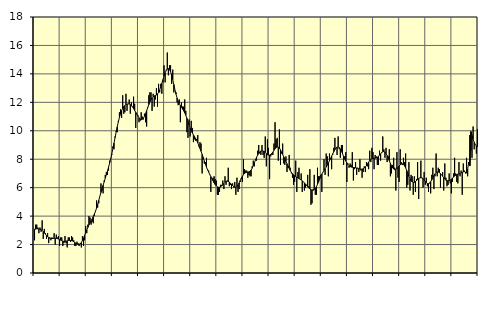
| Category | Piggar | Series 1 |
|---|---|---|
| nan | 2.3 | 3.09 |
| 87.0 | 3.4 | 3.09 |
| 87.0 | 3.4 | 3.11 |
| 87.0 | 3.2 | 3.11 |
| 87.0 | 2.8 | 3.1 |
| 87.0 | 3.2 | 3.08 |
| 87.0 | 2.9 | 3.04 |
| 87.0 | 3.7 | 2.99 |
| 87.0 | 2.4 | 2.91 |
| 87.0 | 3.1 | 2.82 |
| 87.0 | 2.8 | 2.72 |
| 87.0 | 2.4 | 2.63 |
| nan | 2.8 | 2.55 |
| 88.0 | 2.1 | 2.5 |
| 88.0 | 2.5 | 2.45 |
| 88.0 | 2.3 | 2.43 |
| 88.0 | 2.5 | 2.43 |
| 88.0 | 2.4 | 2.43 |
| 88.0 | 2.8 | 2.44 |
| 88.0 | 2 | 2.44 |
| 88.0 | 2.7 | 2.44 |
| 88.0 | 2.5 | 2.42 |
| 88.0 | 2.6 | 2.39 |
| 88.0 | 1.9 | 2.35 |
| nan | 2.5 | 2.31 |
| 89.0 | 2.5 | 2.27 |
| 89.0 | 1.9 | 2.24 |
| 89.0 | 2.1 | 2.22 |
| 89.0 | 2.6 | 2.23 |
| 89.0 | 2.1 | 2.24 |
| 89.0 | 1.8 | 2.26 |
| 89.0 | 2.5 | 2.28 |
| 89.0 | 2.5 | 2.29 |
| 89.0 | 2.2 | 2.29 |
| 89.0 | 2.6 | 2.27 |
| 89.0 | 2.5 | 2.25 |
| nan | 2.3 | 2.2 |
| 90.0 | 1.9 | 2.15 |
| 90.0 | 1.9 | 2.09 |
| 90.0 | 2.2 | 2.04 |
| 90.0 | 2.1 | 2.01 |
| 90.0 | 1.9 | 2 |
| 90.0 | 2.1 | 2.05 |
| 90.0 | 1.8 | 2.14 |
| 90.0 | 2.6 | 2.28 |
| 90.0 | 1.9 | 2.45 |
| 90.0 | 2.3 | 2.64 |
| 90.0 | 3.3 | 2.84 |
| nan | 2.8 | 3.03 |
| 91.0 | 3.4 | 3.21 |
| 91.0 | 4 | 3.38 |
| 91.0 | 3.9 | 3.52 |
| 91.0 | 3.4 | 3.67 |
| 91.0 | 3.6 | 3.81 |
| 91.0 | 3.5 | 3.97 |
| 91.0 | 4 | 4.14 |
| 91.0 | 4.3 | 4.34 |
| 91.0 | 5.1 | 4.57 |
| 91.0 | 4.6 | 4.83 |
| 91.0 | 4.9 | 5.11 |
| nan | 5.4 | 5.39 |
| 92.0 | 6.3 | 5.66 |
| 92.0 | 5.8 | 5.93 |
| 92.0 | 5.6 | 6.17 |
| 92.0 | 6.5 | 6.41 |
| 92.0 | 6.9 | 6.66 |
| 92.0 | 7.1 | 6.91 |
| 92.0 | 6.9 | 7.16 |
| 92.0 | 7.2 | 7.44 |
| 92.0 | 7.9 | 7.73 |
| 92.0 | 8 | 8.04 |
| 92.0 | 8.3 | 8.38 |
| nan | 8.9 | 8.75 |
| 93.0 | 8.7 | 9.13 |
| 93.0 | 9.6 | 9.52 |
| 93.0 | 10 | 9.91 |
| 93.0 | 9.9 | 10.28 |
| 93.0 | 10.7 | 10.63 |
| 93.0 | 11.3 | 10.94 |
| 93.0 | 11.5 | 11.2 |
| 93.0 | 10.9 | 11.42 |
| 93.0 | 12.5 | 11.58 |
| 93.0 | 11.2 | 11.7 |
| 93.0 | 11.3 | 11.78 |
| nan | 12.6 | 11.84 |
| 94.0 | 11.4 | 11.87 |
| 94.0 | 11.9 | 11.89 |
| 94.0 | 12.2 | 11.88 |
| 94.0 | 11.2 | 11.84 |
| 94.0 | 12 | 11.77 |
| 94.0 | 11.7 | 11.67 |
| 94.0 | 12.4 | 11.56 |
| 94.0 | 11.9 | 11.43 |
| 94.0 | 10.2 | 11.3 |
| 94.0 | 11.2 | 11.16 |
| 94.0 | 11.1 | 11.04 |
| nan | 10.6 | 10.92 |
| 95.0 | 10.7 | 10.83 |
| 95.0 | 11.3 | 10.78 |
| 95.0 | 11 | 10.8 |
| 95.0 | 10.8 | 10.88 |
| 95.0 | 11.2 | 11.02 |
| 95.0 | 10.6 | 11.2 |
| 95.0 | 10.3 | 11.41 |
| 95.0 | 11.6 | 11.63 |
| 95.0 | 12.5 | 11.84 |
| 95.0 | 12.7 | 12.03 |
| 95.0 | 12.7 | 12.19 |
| nan | 11.4 | 12.32 |
| 96.0 | 12.6 | 12.4 |
| 96.0 | 11.7 | 12.45 |
| 96.0 | 12.2 | 12.48 |
| 96.0 | 13 | 12.52 |
| 96.0 | 11.7 | 12.59 |
| 96.0 | 13.3 | 12.7 |
| 96.0 | 12.7 | 12.87 |
| 96.0 | 13.3 | 13.09 |
| 96.0 | 12.6 | 13.34 |
| 96.0 | 13.4 | 13.6 |
| 96.0 | 14.6 | 13.85 |
| nan | 13.4 | 14.07 |
| 97.0 | 14.3 | 14.24 |
| 97.0 | 15.5 | 14.34 |
| 97.0 | 13.9 | 14.37 |
| 97.0 | 14.6 | 14.3 |
| 97.0 | 14.6 | 14.15 |
| 97.0 | 13.3 | 13.91 |
| 97.0 | 14.3 | 13.6 |
| 97.0 | 12.7 | 13.25 |
| 97.0 | 12.9 | 12.9 |
| 97.0 | 12.7 | 12.58 |
| 97.0 | 12 | 12.3 |
| nan | 11.8 | 12.08 |
| 98.0 | 12.2 | 11.91 |
| 98.0 | 10.6 | 11.77 |
| 98.0 | 12 | 11.65 |
| 98.0 | 11.7 | 11.54 |
| 98.0 | 11.7 | 11.41 |
| 98.0 | 12.2 | 11.26 |
| 98.0 | 11.4 | 11.09 |
| 98.0 | 9.9 | 10.88 |
| 98.0 | 9.5 | 10.65 |
| 98.0 | 10.8 | 10.42 |
| 98.0 | 9.6 | 10.2 |
| nan | 10.7 | 10.01 |
| 99.0 | 10.2 | 9.85 |
| 99.0 | 9.2 | 9.71 |
| 99.0 | 9.4 | 9.59 |
| 99.0 | 9.3 | 9.46 |
| 99.0 | 9.4 | 9.32 |
| 99.0 | 9.7 | 9.15 |
| 99.0 | 8.9 | 8.96 |
| 99.0 | 9.2 | 8.76 |
| 99.0 | 9.1 | 8.56 |
| 99.0 | 7 | 8.34 |
| 99.0 | 8 | 8.12 |
| nan | 7.7 | 7.88 |
| 0.0 | 7.8 | 7.66 |
| 0.0 | 8.1 | 7.44 |
| 0.0 | 7.3 | 7.26 |
| 0.0 | 7.2 | 7.09 |
| 0.0 | 6.9 | 6.93 |
| 0.0 | 5.7 | 6.78 |
| 0.0 | 6.6 | 6.63 |
| 0.0 | 6.7 | 6.48 |
| 0.0 | 6.8 | 6.34 |
| 0.0 | 6.6 | 6.22 |
| 0.0 | 6.5 | 6.13 |
| nan | 5.5 | 6.06 |
| 1.0 | 5.5 | 6.03 |
| 1.0 | 5.7 | 6.03 |
| 1.0 | 6.2 | 6.06 |
| 1.0 | 6.2 | 6.12 |
| 1.0 | 6.5 | 6.2 |
| 1.0 | 5.9 | 6.29 |
| 1.0 | 6.8 | 6.38 |
| 1.0 | 6.2 | 6.43 |
| 1.0 | 6.5 | 6.46 |
| 1.0 | 7.4 | 6.44 |
| 1.0 | 6.1 | 6.39 |
| nan | 6.2 | 6.32 |
| 2.0 | 5.9 | 6.24 |
| 2.0 | 6.3 | 6.16 |
| 2.0 | 6 | 6.09 |
| 2.0 | 6.4 | 6.04 |
| 2.0 | 5.5 | 6.04 |
| 2.0 | 6.7 | 6.09 |
| 2.0 | 5.7 | 6.19 |
| 2.0 | 5.9 | 6.33 |
| 2.0 | 6.4 | 6.5 |
| 2.0 | 6.6 | 6.66 |
| 2.0 | 6.4 | 6.8 |
| nan | 8 | 6.92 |
| 3.0 | 7.3 | 7 |
| 3.0 | 7.2 | 7.06 |
| 3.0 | 7.2 | 7.08 |
| 3.0 | 6.7 | 7.1 |
| 3.0 | 6.9 | 7.11 |
| 3.0 | 6.8 | 7.16 |
| 3.0 | 6.8 | 7.24 |
| 3.0 | 7.5 | 7.37 |
| 3.0 | 7.9 | 7.54 |
| 3.0 | 7.5 | 7.74 |
| 3.0 | 8 | 7.94 |
| nan | 7.9 | 8.13 |
| 4.0 | 8.6 | 8.29 |
| 4.0 | 9 | 8.42 |
| 4.0 | 8.4 | 8.52 |
| 4.0 | 8.3 | 8.58 |
| 4.0 | 9 | 8.6 |
| 4.0 | 8.3 | 8.58 |
| 4.0 | 8.1 | 8.54 |
| 4.0 | 9.6 | 8.47 |
| 4.0 | 7.5 | 8.39 |
| 4.0 | 9.4 | 8.32 |
| 4.0 | 8.8 | 8.29 |
| nan | 6.6 | 8.29 |
| 5.0 | 8.2 | 8.33 |
| 5.0 | 8.3 | 8.4 |
| 5.0 | 8.3 | 8.5 |
| 5.0 | 9.1 | 8.62 |
| 5.0 | 10.6 | 8.73 |
| 5.0 | 9.4 | 8.82 |
| 5.0 | 9.5 | 8.87 |
| 5.0 | 7.9 | 8.85 |
| 5.0 | 10.1 | 8.78 |
| 5.0 | 7.6 | 8.66 |
| 5.0 | 8.4 | 8.5 |
| nan | 9.1 | 8.34 |
| 6.0 | 7.7 | 8.17 |
| 6.0 | 7.6 | 8.01 |
| 6.0 | 8.2 | 7.85 |
| 6.0 | 7.1 | 7.68 |
| 6.0 | 7.4 | 7.52 |
| 6.0 | 8.3 | 7.36 |
| 6.0 | 7.4 | 7.21 |
| 6.0 | 7 | 7.08 |
| 6.0 | 6.7 | 6.98 |
| 6.0 | 6.2 | 6.9 |
| 6.0 | 6.4 | 6.84 |
| nan | 7.9 | 6.79 |
| 7.0 | 5.7 | 6.74 |
| 7.0 | 7.1 | 6.69 |
| 7.0 | 7.4 | 6.64 |
| 7.0 | 6.6 | 6.59 |
| 7.0 | 7 | 6.54 |
| 7.0 | 5.7 | 6.48 |
| 7.0 | 6.4 | 6.41 |
| 7.0 | 5.8 | 6.34 |
| 7.0 | 6 | 6.25 |
| 7.0 | 6.2 | 6.16 |
| 7.0 | 6.9 | 6.07 |
| nan | 6.1 | 5.98 |
| 8.0 | 7.3 | 5.9 |
| 8.0 | 4.8 | 5.85 |
| 8.0 | 4.9 | 5.82 |
| 8.0 | 5.9 | 5.82 |
| 8.0 | 6.9 | 5.86 |
| 8.0 | 5.5 | 5.94 |
| 8.0 | 5.5 | 6.07 |
| 8.0 | 7.4 | 6.23 |
| 8.0 | 6.8 | 6.41 |
| 8.0 | 6.8 | 6.6 |
| 8.0 | 6.9 | 6.78 |
| nan | 5.7 | 6.95 |
| 9.0 | 7.1 | 7.09 |
| 9.0 | 8 | 7.21 |
| 9.0 | 6.9 | 7.33 |
| 9.0 | 8.4 | 7.45 |
| 9.0 | 8.2 | 7.58 |
| 9.0 | 6.8 | 7.73 |
| 9.0 | 8.4 | 7.89 |
| 9.0 | 8 | 8.05 |
| 9.0 | 7.3 | 8.22 |
| 9.0 | 8.3 | 8.38 |
| 9.0 | 8.8 | 8.53 |
| nan | 9.5 | 8.67 |
| 10.0 | 8.8 | 8.78 |
| 10.0 | 8.3 | 8.86 |
| 10.0 | 9.6 | 8.87 |
| 10.0 | 8.7 | 8.83 |
| 10.0 | 8.1 | 8.72 |
| 10.0 | 9 | 8.57 |
| 10.0 | 9 | 8.39 |
| 10.0 | 7.6 | 8.2 |
| 10.0 | 8.2 | 8.02 |
| 10.0 | 8.5 | 7.87 |
| 10.0 | 6.4 | 7.75 |
| nan | 7.7 | 7.64 |
| 11.0 | 7.4 | 7.55 |
| 11.0 | 7.7 | 7.49 |
| 11.0 | 7.6 | 7.45 |
| 11.0 | 8.5 | 7.43 |
| 11.0 | 6.5 | 7.42 |
| 11.0 | 7.3 | 7.41 |
| 11.0 | 7.8 | 7.4 |
| 11.0 | 6.9 | 7.38 |
| 11.0 | 7.4 | 7.36 |
| 11.0 | 7.1 | 7.33 |
| 11.0 | 8 | 7.31 |
| nan | 7.2 | 7.3 |
| 12.0 | 6.7 | 7.3 |
| 12.0 | 7.1 | 7.33 |
| 12.0 | 7.5 | 7.38 |
| 12.0 | 7.1 | 7.46 |
| 12.0 | 7.8 | 7.56 |
| 12.0 | 7.5 | 7.68 |
| 12.0 | 7.3 | 7.8 |
| 12.0 | 8.6 | 7.91 |
| 12.0 | 7.8 | 7.99 |
| 12.0 | 8.8 | 8.04 |
| 12.0 | 8.5 | 8.06 |
| nan | 7.3 | 8.06 |
| 13.0 | 8.3 | 8.07 |
| 13.0 | 8.2 | 8.09 |
| 13.0 | 7.6 | 8.13 |
| 13.0 | 7.6 | 8.2 |
| 13.0 | 8.6 | 8.29 |
| 13.0 | 7.9 | 8.38 |
| 13.0 | 8.5 | 8.47 |
| 13.0 | 9.6 | 8.53 |
| 13.0 | 8.7 | 8.54 |
| 13.0 | 8.1 | 8.5 |
| 13.0 | 8.8 | 8.4 |
| nan | 7.8 | 8.26 |
| 14.0 | 8.2 | 8.09 |
| 14.0 | 8.7 | 7.9 |
| 14.0 | 6.8 | 7.71 |
| 14.0 | 7 | 7.54 |
| 14.0 | 7.6 | 7.4 |
| 14.0 | 8.1 | 7.31 |
| 14.0 | 7.4 | 7.26 |
| 14.0 | 5.8 | 7.27 |
| 14.0 | 8.5 | 7.33 |
| 14.0 | 6.7 | 7.42 |
| 14.0 | 6.4 | 7.52 |
| nan | 8.7 | 7.61 |
| 15.0 | 7.8 | 7.66 |
| 15.0 | 7.6 | 7.67 |
| 15.0 | 8.1 | 7.63 |
| 15.0 | 7.8 | 7.54 |
| 15.0 | 8.4 | 7.39 |
| 15.0 | 6 | 7.21 |
| 15.0 | 6.2 | 7 |
| 15.0 | 7.8 | 6.8 |
| 15.0 | 5.8 | 6.62 |
| 15.0 | 6.9 | 6.48 |
| 15.0 | 6.8 | 6.4 |
| nan | 5.5 | 6.37 |
| 16.0 | 6.8 | 6.38 |
| 16.0 | 5.7 | 6.43 |
| 16.0 | 6.6 | 6.5 |
| 16.0 | 7.8 | 6.57 |
| 16.0 | 5.2 | 6.64 |
| 16.0 | 6.7 | 6.69 |
| 16.0 | 7.9 | 6.7 |
| 16.0 | 6.7 | 6.68 |
| 16.0 | 6 | 6.63 |
| 16.0 | 7.1 | 6.54 |
| 16.0 | 6.2 | 6.44 |
| nan | 6.7 | 6.35 |
| 17.0 | 6.1 | 6.29 |
| 17.0 | 5.7 | 6.28 |
| 17.0 | 6.3 | 6.33 |
| 17.0 | 5.6 | 6.42 |
| 17.0 | 6.9 | 6.55 |
| 17.0 | 7.4 | 6.71 |
| 17.0 | 5.9 | 6.85 |
| 17.0 | 6.8 | 6.97 |
| 17.0 | 8.4 | 7.06 |
| 17.0 | 6.8 | 7.1 |
| 17.0 | 7.4 | 7.1 |
| nan | 7.3 | 7.06 |
| 18.0 | 6 | 6.99 |
| 18.0 | 6.9 | 6.9 |
| 18.0 | 7.1 | 6.8 |
| 18.0 | 5.8 | 6.7 |
| 18.0 | 7.7 | 6.6 |
| 18.0 | 6.7 | 6.53 |
| 18.0 | 6.1 | 6.49 |
| 18.0 | 6.2 | 6.48 |
| 18.0 | 7 | 6.49 |
| 18.0 | 6.3 | 6.53 |
| 18.0 | 5.6 | 6.59 |
| nan | 6.4 | 6.66 |
| 19.0 | 7 | 6.74 |
| 19.0 | 8.1 | 6.82 |
| 19.0 | 7 | 6.87 |
| 19.0 | 6.4 | 6.92 |
| 19.0 | 6.3 | 6.95 |
| 19.0 | 7.8 | 6.96 |
| 19.0 | 6.8 | 6.99 |
| 19.0 | 7.2 | 7.03 |
| 19.0 | 5.5 | 7.07 |
| 19.0 | 7.7 | 7.11 |
| 19.0 | 7.2 | 7.13 |
| nan | 7 | 7.1 |
| 20.0 | 8.1 | 7.02 |
| 20.0 | 6.8 | 7.3 |
| 20.0 | 7.7 | 7.79 |
| 20.0 | 9.7 | 7.54 |
| 20.0 | 8.6 | 9.94 |
| 20.0 | 8.1 | 9.66 |
| 20.0 | 10.3 | 9.4 |
| 20.0 | 8.7 | 9.19 |
| 20.0 | 9 | 9.03 |
| 20.0 | 8.4 | 8.93 |
| 20.0 | 10.1 | 8.87 |